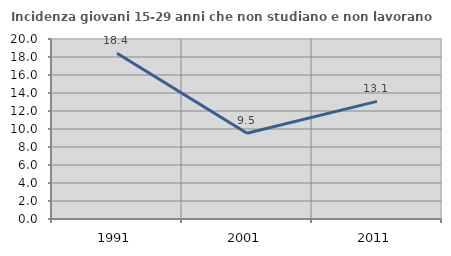
| Category | Incidenza giovani 15-29 anni che non studiano e non lavorano  |
|---|---|
| 1991.0 | 18.414 |
| 2001.0 | 9.524 |
| 2011.0 | 13.065 |